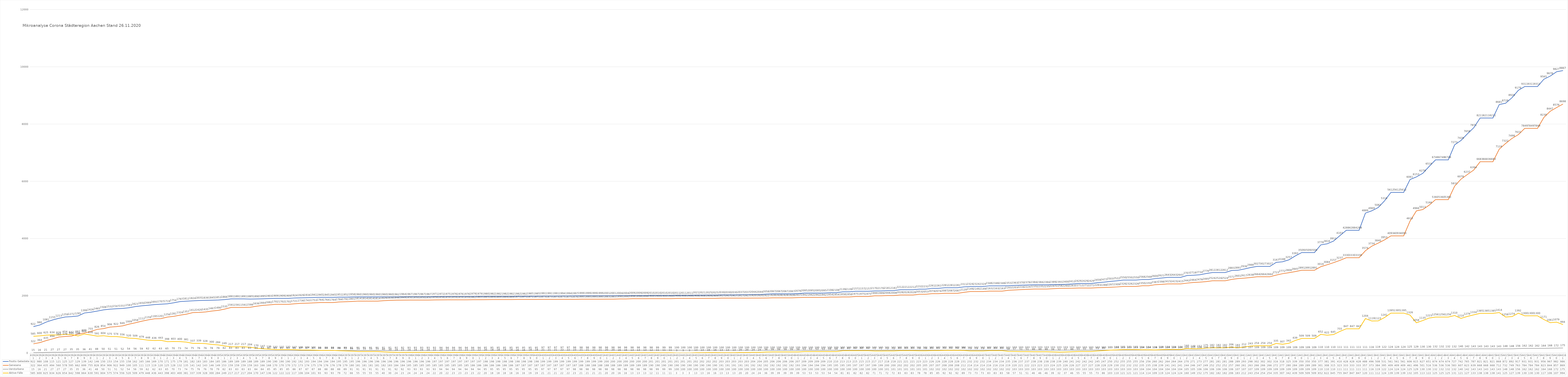
| Category | Positiv Getestete | Genesene | Verstorbene | Aktive Fälle |
|---|---|---|---|---|
| 3/31/20 | 922 | 322 | 15 | 585 |
| 4/1/20 | 980 | 364 | 16 | 600 |
| 4/2/20 | 1081 | 435 | 21 | 625 |
| 4/3/20 | 1155 | 494 | 27 | 634 |
| 4/4/20 | 1213 | 560 | 27 | 626 |
| 4/5/20 | 1259 | 578 | 27 | 654 |
| 4/6/20 | 1272 | 595 | 35 | 642 |
| 4/7/20 | 1295 | 662 | 35 | 598 |
| 4/8/20 | 1399 | 699 | 36 | 664 |
| 4/9/20 | 1426 | 755 | 41 | 630 |
| 4/10/20 | 1465 | 826 | 48 | 591 |
| 4/11/20 | 1508 | 854 | 50 | 604 |
| 4/12/20 | 1532 | 906 | 51 | 575 |
| 4/13/20 | 1547 | 922 | 51 | 574 |
| 4/14/20 | 1557 | 949 | 52 | 556 |
| 4/15/20 | 1583 | 1009 | 54 | 520 |
| 4/16/20 | 1623 | 1058 | 56 | 509 |
| 4/17/20 | 1650 | 1112 | 59 | 479 |
| 4/18/20 | 1669 | 1159 | 62 | 448 |
| 4/19/20 | 1693 | 1195 | 62 | 436 |
| 4/20/20 | 1707 | 1201 | 63 | 443 |
| 4/21/20 | 1719 | 1256 | 65 | 398 |
| 4/22/20 | 1754 | 1281 | 70 | 403 |
| 4/23/20 | 1797 | 1324 | 73 | 400 |
| 4/24/20 | 1812 | 1357 | 74 | 381 |
| 4/25/20 | 1824 | 1412 | 75 | 337 |
| 4/26/20 | 1835 | 1420 | 76 | 339 |
| 4/27/20 | 1839 | 1435 | 76 | 328 |
| 4/28/20 | 1845 | 1467 | 78 | 300 |
| 4/29/20 | 1853 | 1490 | 79 | 284 |
| 4/30/20 | 1866 | 1535 | 82 | 249 |
| 5/1/20 | 1891 | 1591 | 83 | 217 |
| 5/2/20 | 1891 | 1591 | 83 | 217 |
| 5/3/20 | 1891 | 1591 | 83 | 217 |
| 5/4/20 | 1885 | 1598 | 83 | 204 |
| 5/5/20 | 1890 | 1636 | 84 | 170 |
| 5/6/20 | 1895 | 1664 | 84 | 147 |
| 5/7/20 | 1903 | 1682 | 85 | 136 |
| 5/8/20 | 1909 | 1702 | 85 | 122 |
| 5/9/20 | 1909 | 1702 | 85 | 122 |
| 5/10/20 | 1909 | 1702 | 85 | 122 |
| 5/11/20 | 1924 | 1721 | 86 | 117 |
| 5/12/20 | 1929 | 1736 | 87 | 106 |
| 5/13/20 | 1934 | 1743 | 87 | 104 |
| 5/14/20 | 1941 | 1753 | 87 | 101 |
| 5/15/20 | 1945 | 1764 | 88 | 93 |
| 5/16/20 | 1945 | 1764 | 88 | 93 |
| 5/17/20 | 1945 | 1764 | 88 | 93 |
| 5/18/20 | 1951 | 1784 | 88 | 79 |
| 5/19/20 | 1952 | 1791 | 89 | 72 |
| 5/20/20 | 1958 | 1801 | 91 | 66 |
| 5/21/20 | 1960 | 1814 | 91 | 55 |
| 5/22/20 | 1960 | 1814 | 91 | 55 |
| 5/23/20 | 1960 | 1814 | 91 | 55 |
| 5/24/20 | 1960 | 1814 | 91 | 55 |
| 5/25/20 | 1960 | 1829 | 91 | 40 |
| 5/26/20 | 1960 | 1839 | 91 | 30 |
| 5/27/20 | 1962 | 1846 | 92 | 24 |
| 5/28/20 | 1964 | 1849 | 92 | 23 |
| 5/29/20 | 1967 | 1850 | 93 | 24 |
| 5/30/20 | 1967 | 1850 | 93 | 24 |
| 5/31/20 | 1967 | 1850 | 93 | 24 |
| 6/1/20 | 1967 | 1850 | 93 | 24 |
| 6/2/20 | 1971 | 1856 | 93 | 22 |
| 6/3/20 | 1972 | 1858 | 94 | 20 |
| 6/4/20 | 1975 | 1859 | 94 | 22 |
| 6/5/20 | 1976 | 1859 | 94 | 23 |
| 6/6/20 | 1976 | 1859 | 94 | 23 |
| 6/7/20 | 1976 | 1859 | 94 | 23 |
| 6/8/20 | 1979 | 1862 | 94 | 23 |
| 6/9/20 | 1979 | 1863 | 94 | 22 |
| 6/10/20 | 1980 | 1865 | 95 | 20 |
| 6/11/20 | 1982 | 1869 | 95 | 18 |
| 6/12/20 | 1982 | 1869 | 95 | 18 |
| 6/13/20 | 1982 | 1869 | 95 | 18 |
| 6/14/20 | 1982 | 1869 | 95 | 18 |
| 6/15/20 | 1982 | 1871 | 95 | 16 |
| 6/16/20 | 1982 | 1871 | 95 | 16 |
| 6/17/20 | 1985 | 1871 | 95 | 19 |
| 6/18/20 | 1985 | 1871 | 95 | 19 |
| 6/19/20 | 1991 | 1873 | 97 | 21 |
| 6/20/20 | 1991 | 1873 | 97 | 21 |
| 6/21/20 | 1991 | 1873 | 97 | 21 |
| 6/22/20 | 1994 | 1875 | 97 | 22 |
| 6/23/20 | 1994 | 1875 | 97 | 22 |
| 6/24/20 | 1997 | 1876 | 98 | 23 |
| 6/25/20 | 1999 | 1880 | 98 | 21 |
| 6/26/20 | 1999 | 1880 | 98 | 21 |
| 6/27/20 | 1999 | 1880 | 98 | 21 |
| 6/28/20 | 1999 | 1880 | 98 | 21 |
| 6/29/20 | 2001 | 1883 | 98 | 20 |
| 6/30/20 | 2001 | 1883 | 98 | 20 |
| 7/1/20 | 2004 | 1890 | 98 | 16 |
| 7/2/20 | 2004 | 1890 | 98 | 16 |
| 7/3/20 | 2009 | 1898 | 98 | 13 |
| 7/4/20 | 2009 | 1898 | 98 | 13 |
| 7/5/20 | 2009 | 1898 | 98 | 13 |
| 7/6/20 | 2010 | 1900 | 98 | 12 |
| 7/7/20 | 2010 | 1900 | 99 | 11 |
| 7/8/20 | 2010 | 1900 | 99 | 11 |
| 7/9/20 | 2010 | 1900 | 99 | 11 |
| 7/10/20 | 2011 | 1908 | 100 | 3 |
| 7/11/20 | 2011 | 1908 | 100 | 3 |
| 7/12/20 | 2011 | 1908 | 100 | 3 |
| 7/13/20 | 2021 | 1908 | 100 | 13 |
| 7/14/20 | 2021 | 1908 | 100 | 13 |
| 7/15/20 | 2025 | 1909 | 100 | 16 |
| 7/16/20 | 2025 | 1909 | 100 | 16 |
| 7/17/20 | 2030 | 1917 | 100 | 13 |
| 7/18/20 | 2030 | 1917 | 100 | 13 |
| 7/19/20 | 2030 | 1917 | 100 | 13 |
| 7/20/20 | 2037 | 1917 | 100 | 20 |
| 7/21/20 | 2037 | 1917 | 100 | 20 |
| 7/22/20 | 2044 | 1920 | 100 | 24 |
| 7/23/20 | 2044 | 1920 | 100 | 24 |
| 7/24/20 | 2058 | 1922 | 100 | 36 |
| 7/25/20 | 2067 | 1928 | 100 | 39 |
| 7/26/20 | 2067 | 1928 | 100 | 39 |
| 7/27/20 | 2067 | 1928 | 100 | 39 |
| 7/28/20 | 2067 | 1928 | 100 | 39 |
| 7/29/20 | 2076 | 1937 | 100 | 39 |
| 7/30/20 | 2095 | 1942 | 100 | 53 |
| 7/31/20 | 2095 | 1942 | 100 | 53 |
| 8/1/20 | 2095 | 1942 | 100 | 53 |
| 8/2/20 | 2095 | 1942 | 100 | 53 |
| 8/3/20 | 2108 | 1954 | 100 | 54 |
| 8/4/20 | 2108 | 1954 | 100 | 54 |
| 8/5/20 | 2139 | 1958 | 100 | 81 |
| 8/6/20 | 2139 | 1958 | 100 | 81 |
| 8/7/20 | 2157 | 1975 | 100 | 82 |
| 8/8/20 | 2157 | 1975 | 100 | 82 |
| 8/9/20 | 2157 | 1975 | 100 | 82 |
| 8/10/20 | 2170 | 1999 | 100 | 71 |
| 8/11/20 | 2170 | 1999 | 100 | 71 |
| 8/12/20 | 2181 | 2008 | 101 | 72 |
| 8/13/20 | 2181 | 2008 | 101 | 72 |
| 8/14/20 | 2212 | 2028 | 101 | 83 |
| 8/15/20 | 2212 | 2028 | 101 | 83 |
| 8/16/20 | 2212 | 2028 | 101 | 83 |
| 8/17/20 | 2232 | 2053 | 101 | 78 |
| 8/18/20 | 2232 | 2053 | 101 | 78 |
| 8/19/20 | 2261 | 2074 | 102 | 85 |
| 8/20/20 | 2261 | 2074 | 102 | 85 |
| 8/21/20 | 2281 | 2087 | 102 | 92 |
| 8/22/20 | 2281 | 2087 | 102 | 92 |
| 8/23/20 | 2281 | 2087 | 102 | 92 |
| 8/24/20 | 2311 | 2120 | 102 | 89 |
| 8/25/20 | 2324 | 2149 | 102 | 73 |
| 8/26/20 | 2324 | 2149 | 102 | 73 |
| 8/27/20 | 2324 | 2149 | 102 | 73 |
| 8/28/20 | 2348 | 2163 | 102 | 83 |
| 8/29/20 | 2348 | 2163 | 102 | 83 |
| 8/30/20 | 2348 | 2163 | 102 | 83 |
| 8/31/20 | 2353 | 2193 | 102 | 58 |
| 9/1/20 | 2363 | 2203 | 103 | 57 |
| 9/2/20 | 2370 | 2216 | 103 | 51 |
| 9/3/20 | 2378 | 2224 | 103 | 51 |
| 9/4/20 | 2384 | 2235 | 103 | 46 |
| 9/5/20 | 2384 | 2235 | 103 | 46 |
| 9/6/20 | 2384 | 2235 | 103 | 46 |
| 9/7/20 | 2389 | 2247 | 103 | 39 |
| 9/8/20 | 2393 | 2258 | 103 | 32 |
| 9/9/20 | 2400 | 2260 | 103 | 37 |
| 9/10/20 | 2412 | 2263 | 103 | 46 |
| 9/11/20 | 2429 | 2271 | 103 | 55 |
| 9/12/20 | 2429 | 2271 | 103 | 55 |
| 9/13/20 | 2429 | 2271 | 103 | 55 |
| 9/14/20 | 2459 | 2283 | 103 | 73 |
| 9/15/20 | 2477 | 2288 | 103 | 86 |
| 9/16/20 | 2503 | 2297 | 103 | 103 |
| 9/17/20 | 2522 | 2309 | 103 | 110 |
| 9/18/20 | 2550 | 2326 | 103 | 121 |
| 9/19/20 | 2550 | 2326 | 103 | 121 |
| 9/20/20 | 2550 | 2326 | 103 | 121 |
| 9/21/20 | 2568 | 2350 | 104 | 114 |
| 9/22/20 | 2568 | 2350 | 104 | 114 |
| 9/23/20 | 2600 | 2387 | 104 | 109 |
| 9/24/20 | 2621 | 2398 | 104 | 119 |
| 9/25/20 | 2643 | 2415 | 104 | 124 |
| 9/26/20 | 2643 | 2415 | 104 | 124 |
| 9/27/20 | 2643 | 2415 | 104 | 124 |
| 9/28/20 | 2707 | 2442 | 105 | 160 |
| 9/29/20 | 2718 | 2464 | 105 | 149 |
| 9/30/20 | 2734 | 2476 | 106 | 152 |
| 10/1/20 | 2776 | 2495 | 106 | 175 |
| 10/2/20 | 2812 | 2524 | 106 | 182 |
| 10/3/20 | 2812 | 2524 | 106 | 182 |
| 10/4/20 | 2812 | 2524 | 106 | 182 |
| 10/5/20 | 2883 | 2571 | 106 | 206 |
| 10/6/20 | 2891 | 2601 | 107 | 183 |
| 10/7/20 | 2936 | 2617 | 107 | 212 |
| 10/8/20 | 2988 | 2638 | 107 | 243 |
| 10/9/20 | 3027 | 2664 | 109 | 254 |
| 10/10/20 | 3027 | 2664 | 109 | 254 |
| 10/11/20 | 3027 | 2664 | 109 | 254 |
| 10/12/20 | 3167 | 2723 | 109 | 335 |
| 10/13/20 | 3188 | 2772 | 109 | 307 |
| 10/14/20 | 3257 | 2806 | 109 | 342 |
| 10/15/20 | 3393 | 2845 | 109 | 439 |
| 10/16/20 | 3509 | 2891 | 109 | 509 |
| 10/17/20 | 3509 | 2891 | 109 | 509 |
| 10/18/20 | 3509 | 2891 | 109 | 509 |
| 10/19/20 | 3778 | 3016 | 110 | 652 |
| 10/20/20 | 3816 | 3084 | 110 | 622 |
| 10/21/20 | 3912 | 3157 | 110 | 645 |
| 10/22/20 | 4103 | 3237 | 111 | 755 |
| 10/23/20 | 4288 | 3330 | 111 | 847 |
| 10/24/20 | 4288 | 3330 | 111 | 847 |
| 10/25/20 | 4288 | 3330 | 111 | 847 |
| 10/26/20 | 4889 | 3574 | 111 | 1204 |
| 10/27/20 | 4969 | 3734 | 116 | 1119 |
| 10/28/20 | 5082 | 3840 | 119 | 1123 |
| 10/29/20 | 5316 | 3953 | 122 | 1241 |
| 10/30/20 | 5612 | 4093 | 124 | 1395 |
| 10/31/20 | 5612 | 4093 | 124 | 1395 |
| 11/1/20 | 5612 | 4093 | 124 | 1395 |
| 11/2/20 | 6061 | 4610 | 125 | 1326 |
| 11/3/20 | 6153 | 4966 | 129 | 1058 |
| 11/4/20 | 6278 | 5013 | 130 | 1135 |
| 11/5/20 | 6519 | 5166 | 130 | 1223 |
| 11/6/20 | 6748 | 5360 | 132 | 1256 |
| 11/7/20 | 6748 | 5360 | 132 | 1256 |
| 11/8/20 | 6748 | 5360 | 132 | 1256 |
| 11/9/20 | 7273 | 5831 | 132 | 1310 |
| 11/10/20 | 7426 | 6076 | 140 | 1210 |
| 11/11/20 | 7658 | 6237 | 142 | 1279 |
| 11/12/20 | 7871 | 6394 | 143 | 1334 |
| 11/13/20 | 8211 | 6683 | 143 | 1385 |
| 11/14/20 | 8211 | 6683 | 143 | 1385 |
| 11/15/20 | 8211 | 6683 | 143 | 1385 |
| 11/16/20 | 8681 | 7124 | 143 | 1414 |
| 11/17/20 | 8728 | 7322 | 148 | 1258 |
| 11/18/20 | 8920 | 7498 | 148 | 1274 |
| 11/19/20 | 9179 | 7631 | 156 | 1392 |
| 11/20/20 | 9311 | 7849 | 162 | 1300 |
| 11/21/20 | 9311 | 7849 | 162 | 1300 |
| 11/22/20 | 9311 | 7849 | 162 | 1300 |
| 11/23/20 | 9565 | 8230 | 164 | 1171 |
| 11/24/20 | 9676 | 8447 | 168 | 1061 |
| 11/25/20 | 9827 | 8576 | 172 | 1079 |
| 11/26/20 | 9867 | 8698 | 175 | 994 |